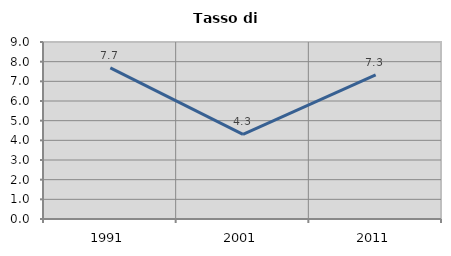
| Category | Tasso di disoccupazione   |
|---|---|
| 1991.0 | 7.684 |
| 2001.0 | 4.302 |
| 2011.0 | 7.325 |